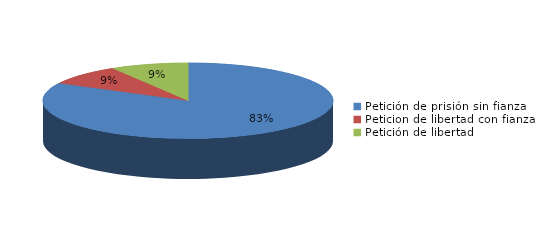
| Category | Series 0 |
|---|---|
| Petición de prisión sin fianza | 57 |
| Peticion de libertad con fianza | 6 |
| Petición de libertad | 6 |